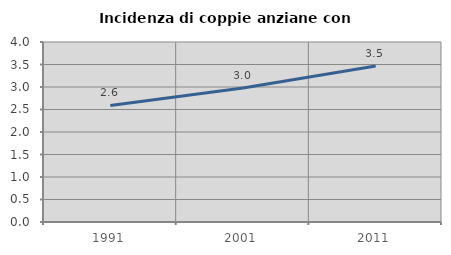
| Category | Incidenza di coppie anziane con figli |
|---|---|
| 1991.0 | 2.591 |
| 2001.0 | 2.979 |
| 2011.0 | 3.464 |